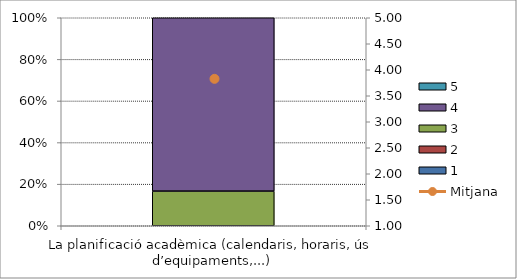
| Category | 1 | 2 | 3 | 4 | 5 |
|---|---|---|---|---|---|
| La planificació acadèmica (calendaris, horaris, ús d’equipaments,...) | 0 | 0 | 2 | 10 | 0 |